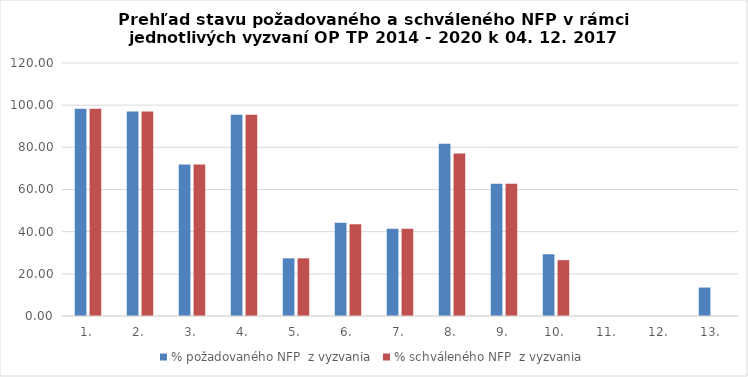
| Category | % požadovaného NFP  z vyzvania | % schváleného NFP  z vyzvania |
|---|---|---|
| 1. | 98.301 | 98.301 |
| 2. | 97.051 | 97.051 |
| 3. | 71.823 | 71.823 |
| 4. | 95.427 | 95.427 |
| 5. | 27.354 | 27.354 |
| 6. | 44.177 | 43.486 |
| 7. | 41.419 | 41.419 |
| 8. | 81.742 | 77.101 |
| 9. | 62.721 | 62.721 |
| 10. | 29.294 | 26.487 |
| 11. | 0 | 0 |
| 12. | 0 | 0 |
| 13. | 13.497 | 0 |